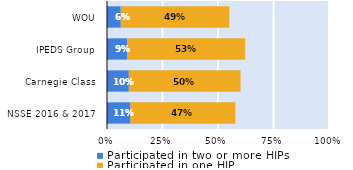
| Category | Participated in two or more HIPs | Participated in one HIP |
|---|---|---|
| NSSE 2016 & 2017 | 0.106 | 0.472 |
| Carnegie Class | 0.098 | 0.503 |
| IPEDS Group | 0.09 | 0.532 |
| WOU | 0.062 | 0.489 |